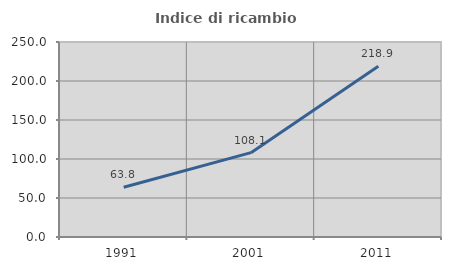
| Category | Indice di ricambio occupazionale  |
|---|---|
| 1991.0 | 63.783 |
| 2001.0 | 108.125 |
| 2011.0 | 218.891 |